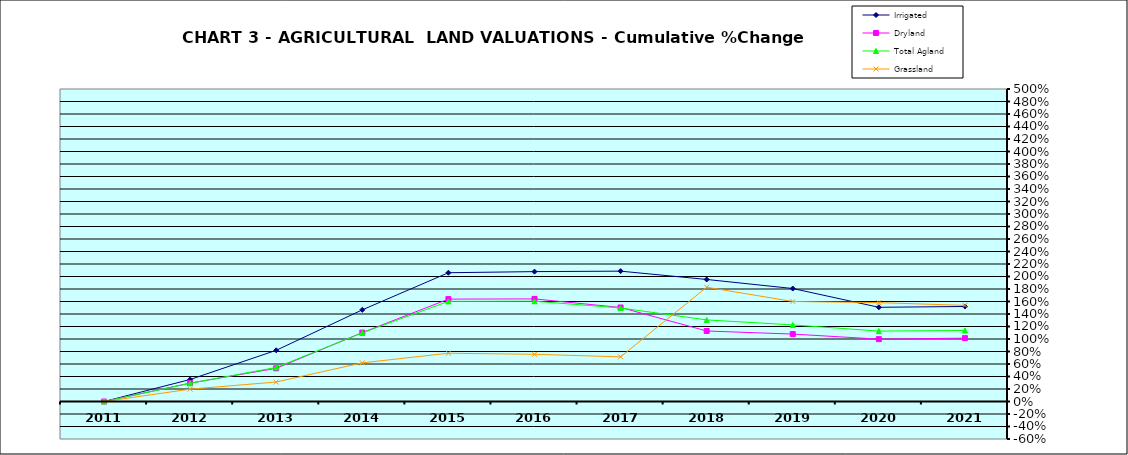
| Category | Irrigated | Dryland | Total Agland | Grassland |
|---|---|---|---|---|
| 2011.0 | 0 | 0 | 0 | 0 |
| 2012.0 | 0.352 | 0.294 | 0.292 | 0.197 |
| 2013.0 | 0.819 | 0.531 | 0.545 | 0.312 |
| 2014.0 | 1.467 | 1.102 | 1.098 | 0.619 |
| 2015.0 | 2.06 | 1.638 | 1.602 | 0.772 |
| 2016.0 | 2.078 | 1.642 | 1.605 | 0.755 |
| 2017.0 | 2.086 | 1.504 | 1.496 | 0.714 |
| 2018.0 | 1.953 | 1.128 | 1.305 | 1.828 |
| 2019.0 | 1.808 | 1.079 | 1.225 | 1.6 |
| 2020.0 | 1.507 | 0.998 | 1.127 | 1.582 |
| 2021.0 | 1.52 | 1.014 | 1.136 | 1.538 |